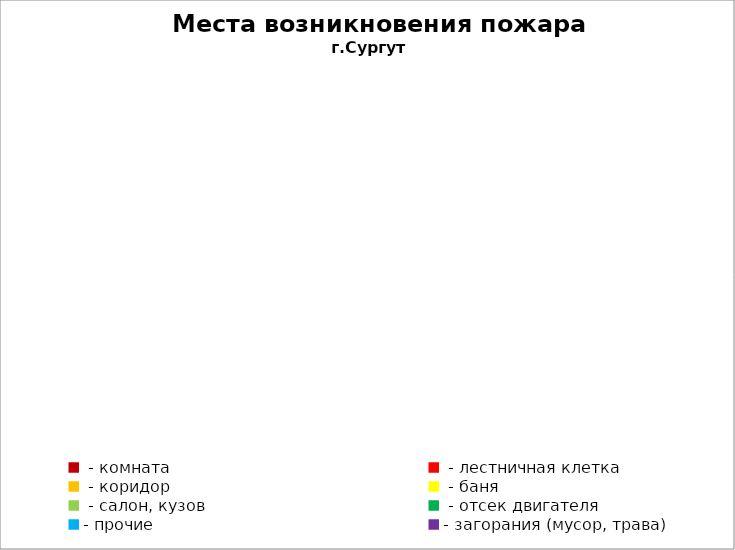
| Category | Места возникновения пожара |
|---|---|
|  - комната | 67 |
|  - лестничная клетка | 11 |
|  - коридор | 7 |
|  - баня | 33 |
|  - салон, кузов | 14 |
|  - отсек двигателя | 40 |
| - прочие | 111 |
| - загорания (мусор, трава)  | 40 |